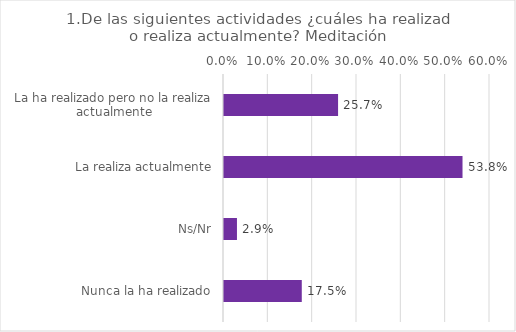
| Category | Series 0 |
|---|---|
| La ha realizado pero no la realiza actualmente | 0.257 |
| La realiza actualmente | 0.538 |
| Ns/Nr | 0.029 |
| Nunca la ha realizado | 0.175 |